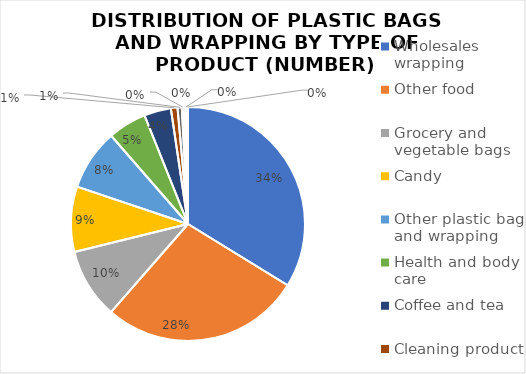
| Category | Series 1 |
|---|---|
| Wholesales wrapping | 1955 |
| Other food | 1601 |
| Grocery and vegetable bags | 563 |
| Candy | 522 |
| Other plastic bags and wrapping | 488 |
| Health and body care | 309 |
| Coffee and tea | 215 |
| Cleaning product | 53 |
| Protective plastic | 34 |
| Juice | 16 |
| Soap and shampoo | 12 |
| Dairy | 12 |
| Car product | 9 |